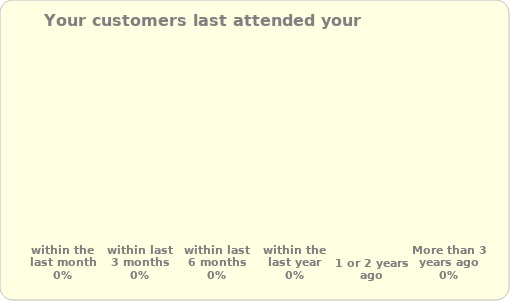
| Category | Series 0 |
|---|---|
| within the last month | 0 |
| within last 3 months | 0 |
| within last 6 months | 0 |
| within the last year | 0 |
| 1 or 2 years ago | 0 |
| More than 3 years ago | 0 |